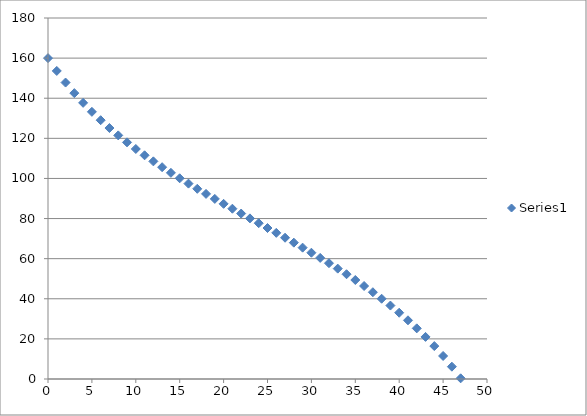
| Category | Series 0 |
|---|---|
| 0.0 | 160 |
| 1.0 | 153.6 |
| 2.0 | 147.814 |
| 3.0 | 142.54 |
| 4.0 | 137.696 |
| 5.0 | 133.215 |
| 6.0 | 129.045 |
| 7.0 | 125.142 |
| 8.0 | 121.468 |
| 9.0 | 117.993 |
| 10.0 | 114.691 |
| 11.0 | 111.539 |
| 12.0 | 108.517 |
| 13.0 | 105.609 |
| 14.0 | 102.799 |
| 15.0 | 100.074 |
| 16.0 | 97.422 |
| 17.0 | 94.833 |
| 18.0 | 92.295 |
| 19.0 | 89.801 |
| 20.0 | 87.341 |
| 21.0 | 84.907 |
| 22.0 | 82.492 |
| 23.0 | 80.088 |
| 24.0 | 77.688 |
| 25.0 | 75.285 |
| 26.0 | 72.871 |
| 27.0 | 70.439 |
| 28.0 | 67.982 |
| 29.0 | 65.492 |
| 30.0 | 62.96 |
| 31.0 | 60.379 |
| 32.0 | 57.738 |
| 33.0 | 55.028 |
| 34.0 | 52.239 |
| 35.0 | 49.357 |
| 36.0 | 46.37 |
| 37.0 | 43.263 |
| 38.0 | 40.02 |
| 39.0 | 36.621 |
| 40.0 | 33.045 |
| 41.0 | 29.267 |
| 42.0 | 25.258 |
| 43.0 | 20.985 |
| 44.0 | 16.408 |
| 45.0 | 11.481 |
| 46.0 | 6.146 |
| 47.0 | 0.337 |